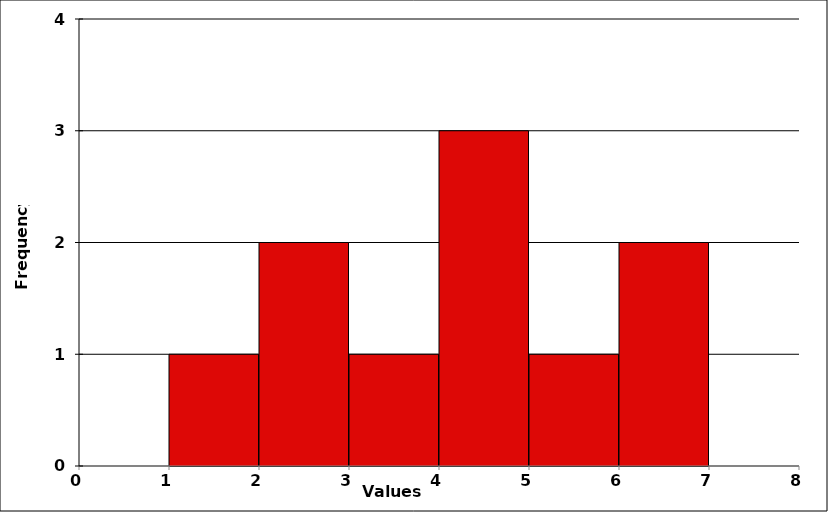
| Category | Series 0 |
|---|---|
| 0.0 | 0 |
| 1.0 | 1 |
| 2.0 | 2 |
| 3.0 | 1 |
| 4.0 | 3 |
| 5.0 | 1 |
| 6.0 | 2 |
| 7.0 | 0 |